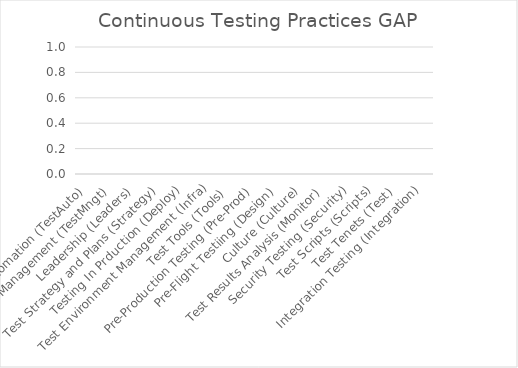
| Category | GAP |
|---|---|
| Test Automation (TestAuto) | 0 |
| Test Management (TestMngt) | 0 |
| Leadership (Leaders) | 0 |
| Test Strategy and Plans (Strategy) | 0 |
| Testing In Prduction (Deploy) | 0 |
| Test Environment Management (Infra) | 0 |
| Test Tools (Tools) | 0 |
| Pre-Production Testing (Pre-Prod) | 0 |
| Pre-Flight Testiing (Design) | 0 |
| Culture (Culture) | 0 |
| Test Results Analysis (Monitor) | 0 |
| Security Testing (Security) | 0 |
| Test Scripts (Scripts) | 0 |
| Test Tenets (Test) | 0 |
| Integration Testing (Integration) | 0 |